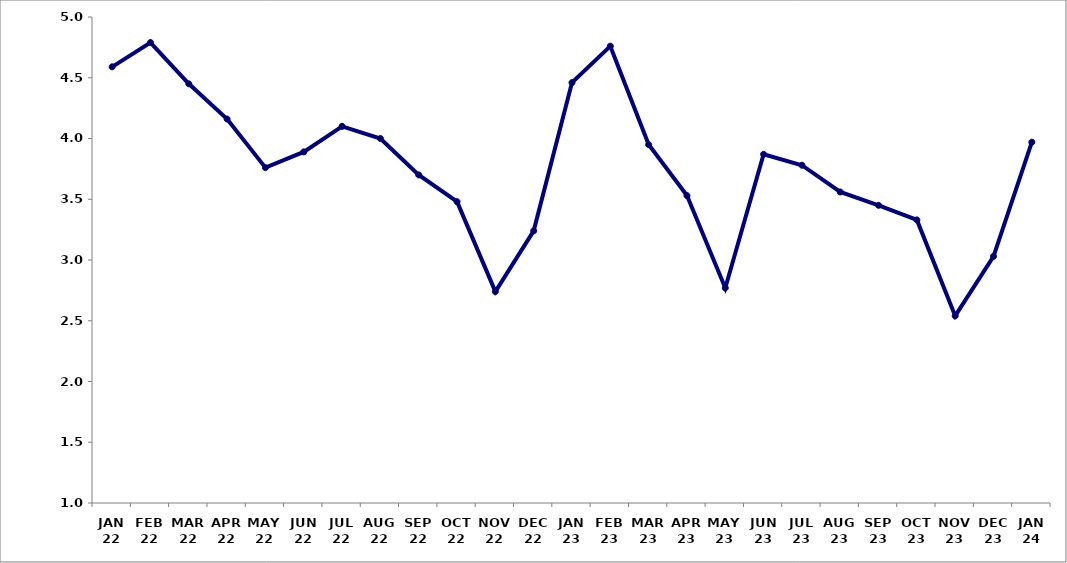
| Category | Series 0 |
|---|---|
| JAN 22 | 4.59 |
| FEB 22 | 4.79 |
| MAR 22 | 4.45 |
| APR 22 | 4.16 |
| MAY 22 | 3.76 |
| JUN 22 | 3.89 |
| JUL 22 | 4.1 |
| AUG 22 | 4 |
| SEP 22 | 3.7 |
| OCT 22 | 3.48 |
| NOV 22 | 2.74 |
| DEC 22 | 3.24 |
| JAN 23 | 4.46 |
| FEB 23 | 4.76 |
| MAR 23 | 3.95 |
| APR 23 | 3.53 |
| MAY 23 | 2.77 |
| JUN 23 | 3.87 |
| JUL 23 | 3.78 |
| AUG 23 | 3.56 |
| SEP 23 | 3.45 |
| OCT 23 | 3.33 |
| NOV 23 | 2.54 |
| DEC 23 | 3.03 |
| JAN 24 | 3.97 |